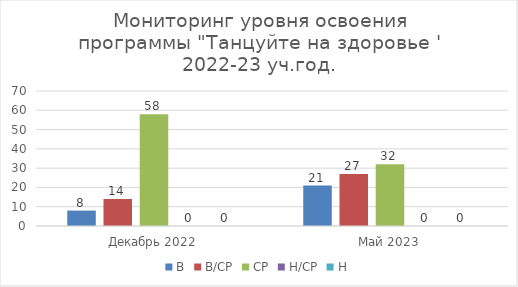
| Category | В | В/СР | СР | Н/СР | Н |
|---|---|---|---|---|---|
| Декабрь 2022 | 8 | 14 | 58 | 0 | 0 |
| Май 2023 | 21 | 27 | 32 | 0 | 0 |